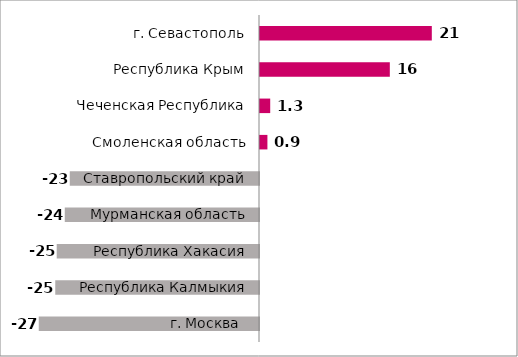
| Category | Series 0 |
|---|---|
| г. Москва  | -27.079 |
| Республика Калмыкия | -25.051 |
| Республика Хакасия | -24.872 |
| Мурманская область | -23.881 |
| Ставропольский край | -23.266 |
| Смоленская область | 0.912 |
| Чеченская Республика | 1.256 |
| Республика Крым | 15.961 |
| г. Севастополь | 21.124 |